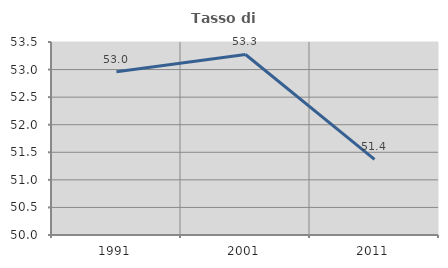
| Category | Tasso di occupazione   |
|---|---|
| 1991.0 | 52.96 |
| 2001.0 | 53.274 |
| 2011.0 | 51.373 |